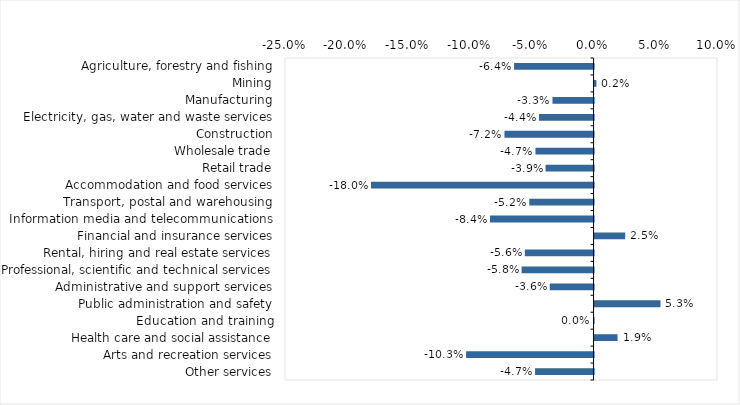
| Category | This week |
|---|---|
| Agriculture, forestry and fishing | -0.064 |
| Mining | 0.002 |
| Manufacturing | -0.033 |
| Electricity, gas, water and waste services | -0.044 |
| Construction | -0.072 |
| Wholesale trade | -0.047 |
| Retail trade | -0.039 |
| Accommodation and food services | -0.18 |
| Transport, postal and warehousing | -0.052 |
| Information media and telecommunications | -0.084 |
| Financial and insurance services | 0.025 |
| Rental, hiring and real estate services | -0.056 |
| Professional, scientific and technical services | -0.058 |
| Administrative and support services | -0.036 |
| Public administration and safety | 0.053 |
| Education and training | 0 |
| Health care and social assistance | 0.019 |
| Arts and recreation services | -0.103 |
| Other services | -0.047 |